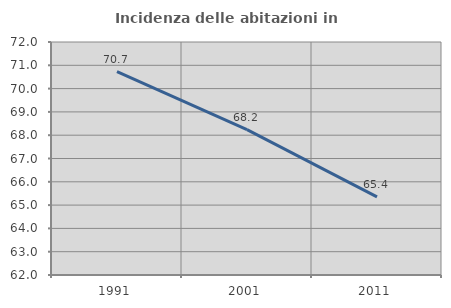
| Category | Incidenza delle abitazioni in proprietà  |
|---|---|
| 1991.0 | 70.725 |
| 2001.0 | 68.241 |
| 2011.0 | 65.351 |